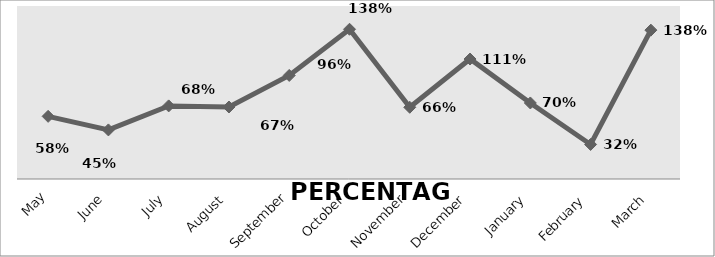
| Category | PERCENTAGE |
|---|---|
| May | 0.579 |
| June | 0.454 |
| July | 0.676 |
| August | 0.666 |
| September | 0.958 |
| October | 1.385 |
| November | 0.663 |
| December | 1.11 |
| January | 0.703 |
| February | 0.32 |
| March | 1.377 |